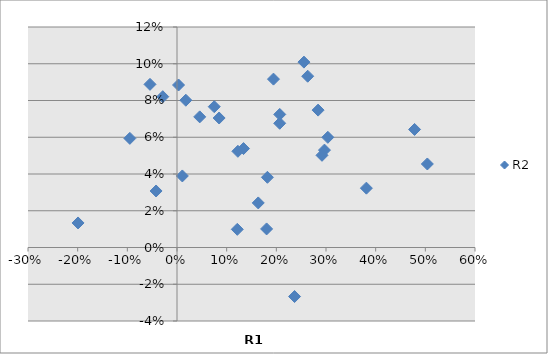
| Category | R2 |
|---|---|
| -0.028609764297258505 | 0.082 |
| 0.18041394910645656 | 0.01 |
| 0.20685846759763937 | 0.072 |
| 0.4783431514103801 | 0.064 |
| 0.18203600727478575 | 0.038 |
| 0.28410082783383594 | 0.075 |
| 0.12137510029336127 | 0.01 |
| 0.29193480512170966 | 0.05 |
| -0.042135342191477104 | 0.031 |
| 0.16357745934473267 | 0.024 |
| 0.003071516504971755 | 0.088 |
| 0.23669895457166476 | -0.027 |
| -0.09490634854637936 | 0.059 |
| 0.045763733373003074 | 0.071 |
| 0.010733187971673414 | 0.039 |
| 0.5040246302576427 | 0.045 |
| 0.3813213213969514 | 0.032 |
| -0.19926209720926222 | 0.013 |
| 0.12258731670152268 | 0.052 |
| 0.01775391048936706 | 0.08 |
| 0.13394703354248627 | 0.054 |
| 0.19424189010487505 | 0.092 |
| -0.054375079867588744 | 0.089 |
| 0.08483355290699834 | 0.07 |
| 0.25557279274896466 | 0.101 |
| 0.20679206874407335 | 0.068 |
| 0.2631816150409313 | 0.093 |
| 0.0749885291547347 | 0.077 |
| 0.30365757568269536 | 0.06 |
| 0.29688863685841316 | 0.053 |